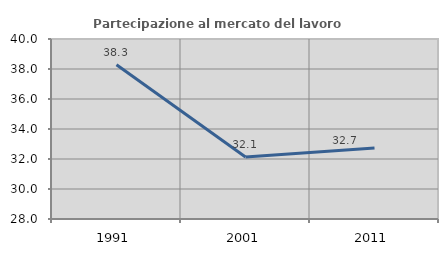
| Category | Partecipazione al mercato del lavoro  femminile |
|---|---|
| 1991.0 | 38.283 |
| 2001.0 | 32.133 |
| 2011.0 | 32.738 |